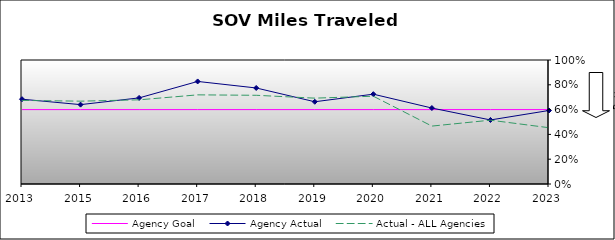
| Category | Agency Goal | Agency Actual | Actual - ALL Agencies |
|---|---|---|---|
| 2013.0 | 0.6 | 0.684 | 0.674 |
| 2015.0 | 0.6 | 0.64 | 0.668 |
| 2016.0 | 0.6 | 0.694 | 0.679 |
| 2017.0 | 0.6 | 0.827 | 0.719 |
| 2018.0 | 0.6 | 0.774 | 0.715 |
| 2019.0 | 0.6 | 0.663 | 0.692 |
| 2020.0 | 0.6 | 0.724 | 0.708 |
| 2021.0 | 0.6 | 0.613 | 0.467 |
| 2022.0 | 0.6 | 0.516 | 0.515 |
| 2023.0 | 0.6 | 0.593 | 0.454 |